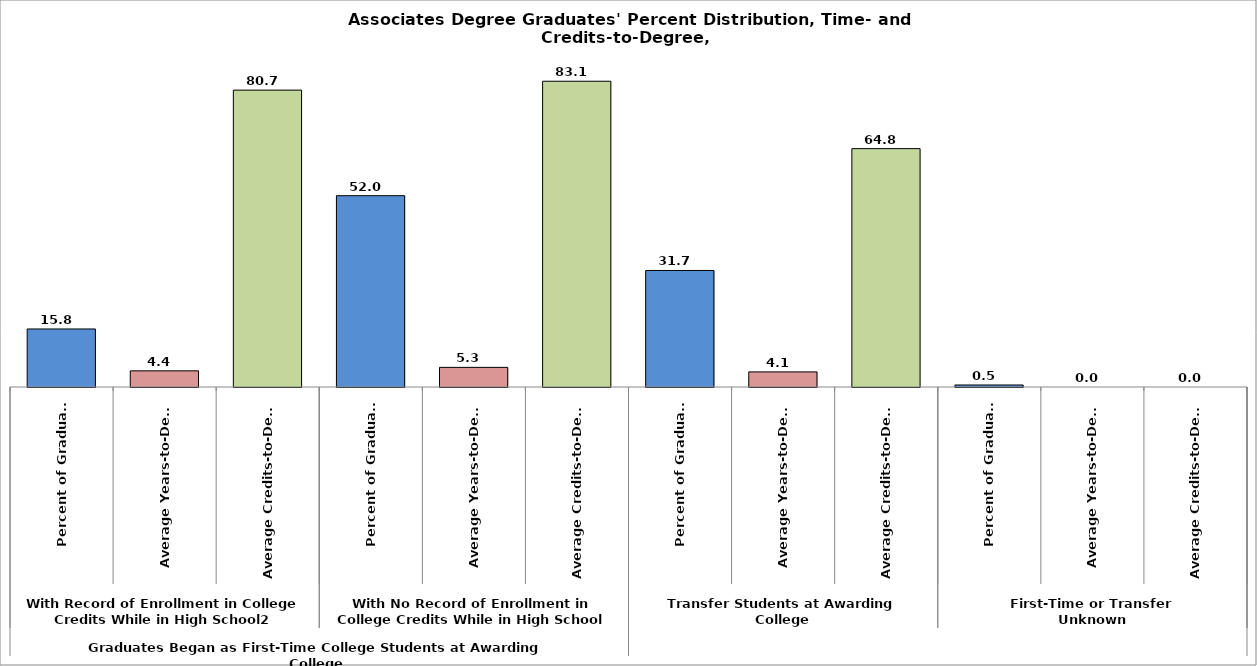
| Category | Series 10 |
|---|---|
| 0 | 15.775 |
| 1 | 4.391 |
| 2 | 80.722 |
| 3 | 52.016 |
| 4 | 5.336 |
| 5 | 83.137 |
| 6 | 31.679 |
| 7 | 4.104 |
| 8 | 64.811 |
| 9 | 0.546 |
| 10 | 0 |
| 11 | 0 |